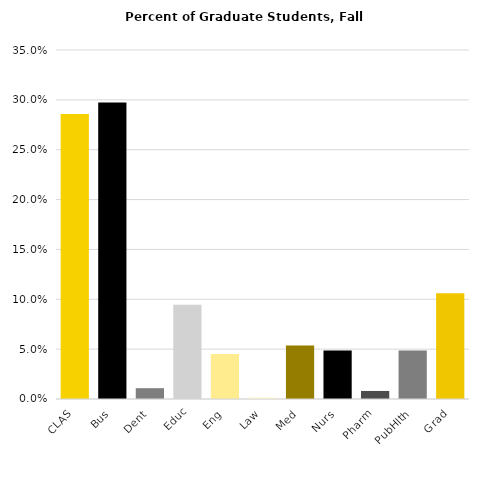
| Category | Series 0 |
|---|---|
| CLAS | 0.286 |
| Bus | 0.297 |
| Dent | 0.011 |
| Educ | 0.095 |
| Eng | 0.045 |
| Law | 0.001 |
| Med | 0.054 |
| Nurs | 0.049 |
| Pharm | 0.008 |
| PubHlth | 0.049 |
| Grad | 0.106 |